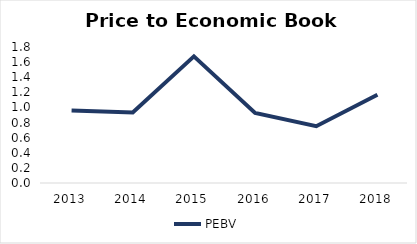
| Category | PEBV |
|---|---|
| 2013.0 | 0.958 |
| 2014.0 | 0.934 |
| 2015.0 | 1.676 |
| 2016.0 | 0.927 |
| 2017.0 | 0.752 |
| 2018.0 | 1.167 |